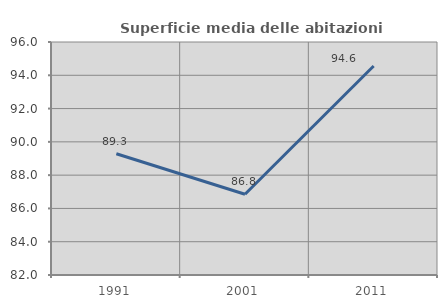
| Category | Superficie media delle abitazioni occupate |
|---|---|
| 1991.0 | 89.285 |
| 2001.0 | 86.85 |
| 2011.0 | 94.555 |